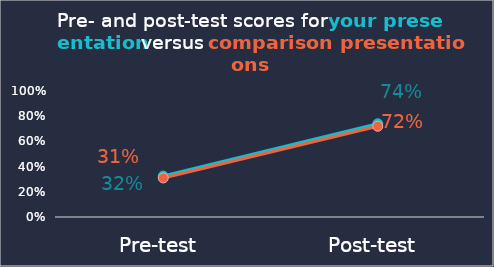
| Category | Series 0 | Series 1 |
|---|---|---|
| Pre-test | 0.325 | 0.31 |
| Post-test | 0.74 | 0.72 |